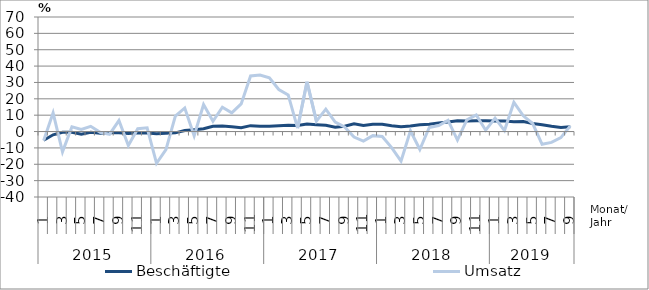
| Category | Beschäftigte | Umsatz |
|---|---|---|
| 0 | -5.3 | -5.5 |
| 1 | -2 | 11.4 |
| 2 | -0.5 | -12.4 |
| 3 | -0.5 | 2.9 |
| 4 | -1.7 | 1.3 |
| 5 | -0.5 | 3.2 |
| 6 | -1.1 | -0.5 |
| 7 | -0.8 | -1.7 |
| 8 | -0.7 | 6.7 |
| 9 | -1.2 | -8.5 |
| 10 | -0.7 | 1.7 |
| 11 | -0.9 | 2.3 |
| 12 | -1.3 | -19.4 |
| 13 | -1.1 | -11 |
| 14 | -0.8 | 9.4 |
| 15 | 0.6 | 14.4 |
| 16 | 1.1 | -2.6 |
| 17 | 1.7 | 16.5 |
| 18 | 3.2 | 6.3 |
| 19 | 3.4 | 14.9 |
| 20 | 3 | 11.4 |
| 21 | 2.4 | 16.9 |
| 22 | 3.6 | 34 |
| 23 | 3.2 | 34.5 |
| 24 | 3.3 | 32.8 |
| 25 | 3.6 | 25.7 |
| 26 | 3.9 | 22.4 |
| 27 | 3.7 | 2.1 |
| 28 | 4.6 | 30.4 |
| 29 | 4.2 | 6.4 |
| 30 | 3.8 | 13.7 |
| 31 | 2.7 | 5.8 |
| 32 | 3.3 | 2.8 |
| 33 | 4.7 | -3.4 |
| 34 | 3.7 | -5.8 |
| 35 | 4.4 | -2.5 |
| 36 | 4.5 | -3 |
| 37 | 3.6 | -9.8 |
| 38 | 2.9 | -18.1 |
| 39 | 3.4 | 0.5 |
| 40 | 4.2 | -11 |
| 41 | 4.5 | 2.5 |
| 42 | 5.3 | 3.7 |
| 43 | 5.8 | 6.8 |
| 44 | 6.6 | -5.2 |
| 45 | 6.5 | 7.1 |
| 46 | 6.6 | 10.1 |
| 47 | 6.6 | 0.8 |
| 48 | 6.4 | 8.2 |
| 49 | 6.5 | 0.6 |
| 50 | 6 | 17.8 |
| 51 | 6.1 | 9.6 |
| 52 | 4.9 | 4.9 |
| 53 | 4.2 | -7.8 |
| 54 | 3.2 | -6.6 |
| 55 | 2.5 | -3.7 |
| 56 | 2.9 | 3.5 |